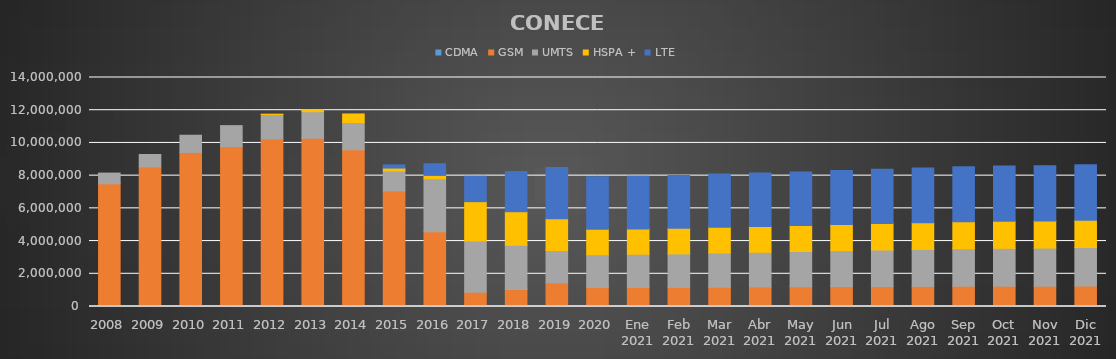
| Category | CDMA | GSM | UMTS | HSPA + | LTE |
|---|---|---|---|---|---|
| 2008 | 0 | 7499370 | 656989 | 0 | 0 |
| 2009 | 0 | 8532691 | 758577 | 0 | 0 |
| 2010 | 0 | 9419193 | 1051309 | 0 | 0 |
| 2011 | 0 | 9774865 | 1282451 | 0 | 0 |
| 2012 | 0 | 10252457 | 1484003 | 21446 | 0 |
| 2013 | 0 | 10287259 | 1622034 | 121593 | 0 |
| 2014 | 0 | 9581956 | 1664758 | 525306 | 0 |
| 2015 | 0 | 7065313 | 1214567 | 183109 | 195630 |
| 2016 | 0 | 4571999 | 3240700 | 201567 | 712557 |
| 2017 | 0 | 873346 | 3135577 | 2399460 | 1551880 |
| 2018 | 0 | 1039373 | 2706058 | 2049418 | 2453201 |
| 2019 | 0 | 1452334 | 1970422 | 1937931 | 3132367 |
| 2020 | 0 | 1158751 | 2009264 | 1548440 | 3212798 |
| Ene 2021 | 0 | 1162024 | 2031223 | 1552277 | 3219750 |
| Feb 2021 | 0 | 1169065 | 2048617 | 1559907 | 3235305 |
| Mar 2021 | 0 | 1181823 | 2091574 | 1572077 | 3258399 |
| Abr 2021 | 0 | 1194833 | 2117779 | 1576757 | 3274515 |
| May 2021 | 0 | 1204467 | 2156961 | 1584433 | 3281752 |
| Jun 2021 | 0 | 1213946 | 2200564 | 1593003 | 3300402 |
| Jul 2021 | 0 | 1219825 | 2234066 | 1615833 | 3313880 |
| Ago 2021 | 0 | 1228903 | 2260790 | 1634392 | 3335574 |
| Sep 2021 | 0 | 1239168 | 2293461 | 1650409 | 3363630 |
| Oct 2021 | 0 | 1242189 | 2313521 | 1656651 | 3369780 |
| Nov 2021 | 0 | 1242721 | 2328072 | 1662588 | 3375164 |
| Dic 2021 | 0 | 1250925 | 2353798 | 1675346 | 3385646 |